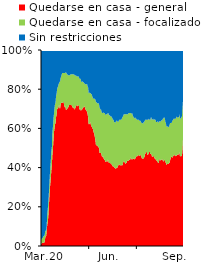
| Category | Quedarse en casa - general | Quedarse en casa - focalizado | Sin restricciones |
|---|---|---|---|
| 2020-03-01 | 1.124 | 2.247 | 96.629 |
| 2020-03-02 | 1.124 | 2.247 | 96.629 |
| 2020-03-03 | 1.685 | 2.247 | 96.067 |
| 2020-03-04 | 1.685 | 2.247 | 96.067 |
| 2020-03-05 | 1.685 | 2.809 | 95.506 |
| 2020-03-06 | 1.685 | 3.371 | 94.944 |
| 2020-03-07 | 1.685 | 3.371 | 94.944 |
| 2020-03-08 | 2.247 | 3.371 | 94.382 |
| 2020-03-09 | 3.933 | 3.371 | 92.697 |
| 2020-03-10 | 5.056 | 2.809 | 92.135 |
| 2020-03-11 | 5.056 | 2.809 | 92.135 |
| 2020-03-12 | 7.865 | 2.247 | 89.888 |
| 2020-03-13 | 10.674 | 5.618 | 83.708 |
| 2020-03-14 | 12.36 | 6.18 | 81.461 |
| 2020-03-15 | 14.607 | 7.303 | 78.09 |
| 2020-03-16 | 19.101 | 6.742 | 74.157 |
| 2020-03-17 | 24.157 | 6.742 | 69.101 |
| 2020-03-18 | 28.652 | 7.303 | 64.045 |
| 2020-03-19 | 32.022 | 8.427 | 59.551 |
| 2020-03-20 | 34.831 | 8.989 | 56.18 |
| 2020-03-21 | 38.764 | 9.551 | 51.685 |
| 2020-03-22 | 41.573 | 8.989 | 49.438 |
| 2020-03-23 | 46.629 | 11.236 | 42.135 |
| 2020-03-24 | 49.438 | 11.236 | 39.326 |
| 2020-03-25 | 53.933 | 10.674 | 35.393 |
| 2020-03-26 | 57.865 | 9.551 | 32.584 |
| 2020-03-27 | 60.112 | 10.112 | 29.775 |
| 2020-03-28 | 62.36 | 10.112 | 27.528 |
| 2020-03-29 | 62.36 | 10.674 | 26.966 |
| 2020-03-30 | 65.73 | 10.674 | 23.596 |
| 2020-03-31 | 66.854 | 10.674 | 22.472 |
| 2020-04-01 | 70.225 | 9.551 | 20.225 |
| 2020-04-02 | 69.663 | 11.236 | 19.101 |
| 2020-04-03 | 70.225 | 11.236 | 18.539 |
| 2020-04-04 | 71.348 | 11.236 | 17.416 |
| 2020-04-05 | 71.91 | 11.236 | 16.854 |
| 2020-04-06 | 70.225 | 13.483 | 16.292 |
| 2020-04-07 | 70.225 | 14.045 | 15.73 |
| 2020-04-08 | 72.472 | 13.483 | 14.045 |
| 2020-04-09 | 73.034 | 13.483 | 13.483 |
| 2020-04-10 | 73.034 | 14.607 | 12.36 |
| 2020-04-11 | 73.034 | 15.169 | 11.798 |
| 2020-04-12 | 73.034 | 15.169 | 11.798 |
| 2020-04-13 | 73.596 | 14.607 | 11.798 |
| 2020-04-14 | 73.034 | 15.169 | 11.798 |
| 2020-04-15 | 70.787 | 17.416 | 11.798 |
| 2020-04-16 | 71.348 | 16.854 | 11.798 |
| 2020-04-17 | 71.348 | 16.854 | 11.798 |
| 2020-04-18 | 69.663 | 19.101 | 11.236 |
| 2020-04-19 | 69.663 | 18.539 | 11.798 |
| 2020-04-20 | 69.663 | 17.978 | 12.36 |
| 2020-04-21 | 70.225 | 17.416 | 12.36 |
| 2020-04-22 | 70.787 | 16.292 | 12.921 |
| 2020-04-23 | 70.787 | 16.292 | 12.921 |
| 2020-04-24 | 71.91 | 15.169 | 12.921 |
| 2020-04-25 | 71.91 | 15.169 | 12.921 |
| 2020-04-26 | 71.91 | 15.169 | 12.921 |
| 2020-04-27 | 71.91 | 15.73 | 12.36 |
| 2020-04-28 | 71.91 | 15.73 | 12.36 |
| 2020-04-29 | 71.91 | 15.73 | 12.36 |
| 2020-04-30 | 71.348 | 16.292 | 12.36 |
| 2020-05-01 | 70.621 | 16.949 | 12.429 |
| 2020-05-02 | 70.621 | 16.949 | 12.429 |
| 2020-05-03 | 70.621 | 16.949 | 12.429 |
| 2020-05-04 | 69.492 | 17.514 | 12.994 |
| 2020-05-05 | 70.621 | 16.949 | 12.429 |
| 2020-05-06 | 70.056 | 16.949 | 12.994 |
| 2020-05-07 | 71.186 | 15.819 | 12.994 |
| 2020-05-08 | 71.751 | 14.689 | 13.559 |
| 2020-05-09 | 71.751 | 15.254 | 12.994 |
| 2020-05-10 | 71.186 | 15.254 | 13.559 |
| 2020-05-11 | 71.751 | 14.689 | 13.559 |
| 2020-05-12 | 71.751 | 14.689 | 13.559 |
| 2020-05-13 | 71.751 | 14.689 | 13.559 |
| 2020-05-14 | 69.492 | 15.819 | 14.689 |
| 2020-05-15 | 70.056 | 15.254 | 14.689 |
| 2020-05-16 | 70.056 | 15.254 | 14.689 |
| 2020-05-17 | 68.927 | 15.819 | 15.254 |
| 2020-05-18 | 69.492 | 14.124 | 16.384 |
| 2020-05-19 | 69.492 | 14.124 | 16.384 |
| 2020-05-20 | 70.056 | 14.124 | 15.819 |
| 2020-05-21 | 70.621 | 12.994 | 16.384 |
| 2020-05-22 | 70.621 | 12.994 | 16.384 |
| 2020-05-23 | 71.186 | 11.864 | 16.949 |
| 2020-05-24 | 71.186 | 11.864 | 16.949 |
| 2020-05-25 | 70.621 | 11.864 | 17.514 |
| 2020-05-26 | 69.492 | 12.994 | 17.514 |
| 2020-05-27 | 69.492 | 12.994 | 17.514 |
| 2020-05-28 | 68.927 | 13.559 | 17.514 |
| 2020-05-29 | 68.362 | 14.124 | 17.514 |
| 2020-05-30 | 67.232 | 14.124 | 18.644 |
| 2020-05-31 | 65.537 | 15.254 | 19.209 |
| 2020-06-01 | 62.147 | 15.819 | 22.034 |
| 2020-06-02 | 62.147 | 15.819 | 22.034 |
| 2020-06-03 | 62.5 | 15.909 | 21.591 |
| 2020-06-04 | 63.277 | 14.689 | 22.034 |
| 2020-06-05 | 62.147 | 15.819 | 22.034 |
| 2020-06-06 | 61.017 | 16.384 | 22.599 |
| 2020-06-07 | 61.017 | 16.384 | 22.599 |
| 2020-06-08 | 59.887 | 16.384 | 23.729 |
| 2020-06-09 | 59.887 | 15.819 | 24.294 |
| 2020-06-10 | 58.757 | 16.384 | 24.859 |
| 2020-06-11 | 57.627 | 17.514 | 24.859 |
| 2020-06-12 | 57.062 | 18.079 | 24.859 |
| 2020-06-13 | 55.367 | 19.774 | 24.859 |
| 2020-06-14 | 54.237 | 20.339 | 25.424 |
| 2020-06-15 | 51.412 | 22.034 | 26.554 |
| 2020-06-16 | 51.412 | 22.034 | 26.554 |
| 2020-06-17 | 51.412 | 21.469 | 27.119 |
| 2020-06-18 | 50.847 | 22.034 | 27.119 |
| 2020-06-19 | 50.847 | 22.034 | 27.119 |
| 2020-06-20 | 50.282 | 22.599 | 27.119 |
| 2020-06-21 | 50.282 | 22.034 | 27.684 |
| 2020-06-22 | 47.458 | 23.164 | 29.379 |
| 2020-06-23 | 47.458 | 22.599 | 29.944 |
| 2020-06-24 | 47.458 | 22.034 | 30.508 |
| 2020-06-25 | 47.458 | 22.034 | 30.508 |
| 2020-06-26 | 46.328 | 22.034 | 31.638 |
| 2020-06-27 | 45.198 | 22.599 | 32.203 |
| 2020-06-28 | 45.763 | 22.034 | 32.203 |
| 2020-06-29 | 45.763 | 22.599 | 31.638 |
| 2020-06-30 | 44.633 | 23.164 | 32.203 |
| 2020-07-01 | 44.068 | 23.729 | 32.203 |
| 2020-07-02 | 44.068 | 23.729 | 32.203 |
| 2020-07-03 | 42.938 | 23.729 | 33.333 |
| 2020-07-04 | 42.938 | 24.294 | 32.768 |
| 2020-07-05 | 43.503 | 23.729 | 32.768 |
| 2020-07-06 | 42.938 | 24.294 | 32.768 |
| 2020-07-07 | 42.938 | 24.294 | 32.768 |
| 2020-07-08 | 44.068 | 23.729 | 32.203 |
| 2020-07-09 | 43.503 | 24.294 | 32.203 |
| 2020-07-10 | 42.373 | 24.294 | 33.333 |
| 2020-07-11 | 42.373 | 24.294 | 33.333 |
| 2020-07-12 | 42.373 | 24.294 | 33.333 |
| 2020-07-13 | 42.373 | 23.729 | 33.898 |
| 2020-07-14 | 41.808 | 24.294 | 33.898 |
| 2020-07-15 | 41.808 | 24.294 | 33.898 |
| 2020-07-16 | 41.243 | 24.294 | 34.463 |
| 2020-07-17 | 40.678 | 24.294 | 35.028 |
| 2020-07-18 | 40.678 | 23.729 | 35.593 |
| 2020-07-19 | 40.678 | 23.729 | 35.593 |
| 2020-07-20 | 40.113 | 23.164 | 36.723 |
| 2020-07-21 | 40.113 | 23.164 | 36.723 |
| 2020-07-22 | 39.548 | 23.164 | 37.288 |
| 2020-07-23 | 39.548 | 23.729 | 36.723 |
| 2020-07-24 | 39.548 | 24.294 | 36.158 |
| 2020-07-25 | 40.113 | 23.729 | 36.158 |
| 2020-07-26 | 40.113 | 23.729 | 36.158 |
| 2020-07-27 | 40.113 | 23.164 | 36.723 |
| 2020-07-28 | 41.243 | 22.034 | 36.723 |
| 2020-07-29 | 41.243 | 22.599 | 36.158 |
| 2020-07-30 | 41.808 | 22.599 | 35.593 |
| 2020-07-31 | 41.243 | 23.164 | 35.593 |
| 2020-08-01 | 41.243 | 23.164 | 35.593 |
| 2020-08-02 | 41.243 | 23.164 | 35.593 |
| 2020-08-03 | 41.243 | 23.164 | 35.593 |
| 2020-08-04 | 41.243 | 23.729 | 35.028 |
| 2020-08-05 | 41.243 | 24.294 | 34.463 |
| 2020-08-06 | 41.808 | 24.294 | 33.898 |
| 2020-08-07 | 43.503 | 23.164 | 33.333 |
| 2020-08-08 | 42.938 | 24.294 | 32.768 |
| 2020-08-09 | 42.938 | 24.294 | 32.768 |
| 2020-08-10 | 42.373 | 24.859 | 32.768 |
| 2020-08-11 | 41.808 | 25.424 | 32.768 |
| 2020-08-12 | 42.373 | 24.859 | 32.768 |
| 2020-08-13 | 42.373 | 24.859 | 32.768 |
| 2020-08-14 | 43.503 | 23.729 | 32.768 |
| 2020-08-15 | 43.503 | 23.729 | 32.768 |
| 2020-08-16 | 43.503 | 23.729 | 32.768 |
| 2020-08-17 | 43.503 | 24.294 | 32.203 |
| 2020-08-18 | 44.068 | 23.729 | 32.203 |
| 2020-08-19 | 44.068 | 23.729 | 32.203 |
| 2020-08-20 | 44.068 | 23.729 | 32.203 |
| 2020-08-21 | 45.198 | 22.599 | 32.203 |
| 2020-08-22 | 44.633 | 23.164 | 32.203 |
| 2020-08-23 | 44.068 | 23.164 | 32.768 |
| 2020-08-24 | 44.633 | 23.164 | 32.203 |
| 2020-08-25 | 44.068 | 22.599 | 33.333 |
| 2020-08-26 | 44.633 | 21.469 | 33.898 |
| 2020-08-27 | 44.633 | 20.904 | 34.463 |
| 2020-08-28 | 44.068 | 20.904 | 35.028 |
| 2020-08-29 | 44.633 | 20.904 | 34.463 |
| 2020-08-30 | 44.633 | 20.904 | 34.463 |
| 2020-08-31 | 45.198 | 19.774 | 35.028 |
| 2020-09-01 | 45.763 | 19.209 | 35.028 |
| 2020-09-02 | 45.763 | 18.644 | 35.593 |
| 2020-09-03 | 45.763 | 18.644 | 35.593 |
| 2020-09-04 | 46.328 | 18.079 | 35.593 |
| 2020-09-05 | 46.328 | 18.079 | 35.593 |
| 2020-09-06 | 46.328 | 18.079 | 35.593 |
| 2020-09-07 | 45.763 | 18.079 | 36.158 |
| 2020-09-08 | 46.328 | 17.514 | 36.158 |
| 2020-09-09 | 46.328 | 17.514 | 36.158 |
| 2020-09-10 | 46.328 | 16.949 | 36.723 |
| 2020-09-11 | 45.198 | 17.514 | 37.288 |
| 2020-09-12 | 44.633 | 18.079 | 37.288 |
| 2020-09-13 | 44.633 | 18.079 | 37.288 |
| 2020-09-14 | 44.633 | 17.514 | 37.853 |
| 2020-09-15 | 44.633 | 18.644 | 36.723 |
| 2020-09-16 | 45.198 | 18.079 | 36.723 |
| 2020-09-17 | 45.763 | 18.079 | 36.158 |
| 2020-09-18 | 47.458 | 16.949 | 35.593 |
| 2020-09-19 | 46.893 | 17.514 | 35.593 |
| 2020-09-20 | 48.023 | 16.384 | 35.593 |
| 2020-09-21 | 48.023 | 16.384 | 35.593 |
| 2020-09-22 | 46.893 | 17.514 | 35.593 |
| 2020-09-23 | 46.328 | 18.079 | 35.593 |
| 2020-09-24 | 46.893 | 17.514 | 35.593 |
| 2020-09-25 | 47.458 | 17.514 | 35.028 |
| 2020-09-26 | 48.023 | 16.384 | 35.593 |
| 2020-09-27 | 48.023 | 16.384 | 35.593 |
| 2020-09-28 | 46.893 | 17.514 | 35.593 |
| 2020-09-29 | 46.893 | 18.644 | 34.463 |
| 2020-09-30 | 46.893 | 18.644 | 34.463 |
| 2020-10-01 | 45.763 | 18.644 | 35.593 |
| 2020-10-02 | 45.455 | 19.318 | 35.227 |
| 2020-10-03 | 45.763 | 18.644 | 35.593 |
| 2020-10-04 | 45.763 | 18.644 | 35.593 |
| 2020-10-05 | 45.763 | 19.209 | 35.028 |
| 2020-10-06 | 44.633 | 19.774 | 35.593 |
| 2020-10-07 | 44.633 | 19.774 | 35.593 |
| 2020-10-08 | 44.633 | 19.774 | 35.593 |
| 2020-10-09 | 43.503 | 19.774 | 36.723 |
| 2020-10-10 | 43.503 | 19.774 | 36.723 |
| 2020-10-11 | 44.068 | 19.209 | 36.723 |
| 2020-10-12 | 42.938 | 20.904 | 36.158 |
| 2020-10-13 | 42.373 | 20.339 | 37.288 |
| 2020-10-14 | 42.373 | 20.904 | 36.723 |
| 2020-10-15 | 43.503 | 20.339 | 36.158 |
| 2020-10-16 | 44.633 | 18.644 | 36.723 |
| 2020-10-17 | 44.068 | 19.774 | 36.158 |
| 2020-10-18 | 43.503 | 19.774 | 36.723 |
| 2020-10-19 | 44.068 | 19.774 | 36.158 |
| 2020-10-20 | 44.068 | 20.339 | 35.593 |
| 2020-10-21 | 43.503 | 20.339 | 36.158 |
| 2020-10-22 | 44.633 | 20.339 | 35.028 |
| 2020-10-23 | 42.938 | 22.034 | 35.028 |
| 2020-10-24 | 43.503 | 22.034 | 34.463 |
| 2020-10-25 | 44.068 | 21.469 | 34.463 |
| 2020-10-26 | 43.503 | 21.469 | 35.028 |
| 2020-10-27 | 42.373 | 20.904 | 36.723 |
| 2020-10-28 | 42.938 | 19.774 | 37.288 |
| 2020-10-29 | 41.243 | 19.774 | 38.983 |
| 2020-10-30 | 41.808 | 19.209 | 38.983 |
| 2020-10-31 | 41.808 | 19.209 | 38.983 |
| 2020-11-01 | 41.808 | 19.209 | 38.983 |
| 2020-11-02 | 41.808 | 18.644 | 39.548 |
| 2020-11-03 | 42.373 | 18.644 | 38.983 |
| 2020-11-04 | 42.373 | 19.209 | 38.418 |
| 2020-11-05 | 43.503 | 19.209 | 37.288 |
| 2020-11-06 | 44.633 | 18.079 | 37.288 |
| 2020-11-07 | 45.198 | 17.514 | 37.288 |
| 2020-11-08 | 45.763 | 16.949 | 37.288 |
| 2020-11-09 | 45.198 | 18.644 | 36.158 |
| 2020-11-10 | 45.198 | 18.644 | 36.158 |
| 2020-11-11 | 45.763 | 18.644 | 35.593 |
| 2020-11-12 | 46.328 | 18.644 | 35.028 |
| 2020-11-13 | 46.328 | 18.644 | 35.028 |
| 2020-11-14 | 46.328 | 18.644 | 35.028 |
| 2020-11-15 | 46.328 | 18.644 | 35.028 |
| 2020-11-16 | 45.763 | 19.209 | 35.028 |
| 2020-11-17 | 45.93 | 19.767 | 34.302 |
| 2020-11-18 | 46.199 | 19.883 | 33.918 |
| 2020-11-19 | 46.471 | 18.824 | 34.706 |
| 2020-11-20 | 46.746 | 18.935 | 34.32 |
| 2020-11-21 | 46.746 | 18.935 | 34.32 |
| 2020-11-22 | 46.746 | 18.935 | 34.32 |
| 2020-11-23 | 47.904 | 19.162 | 32.934 |
| 2020-11-24 | 45.985 | 19.708 | 34.307 |
| 2020-11-25 | 45.802 | 19.084 | 35.115 |
| 2020-11-26 | 45.736 | 19.38 | 34.884 |
| 2020-11-27 | 46.032 | 19.841 | 34.127 |
| 2020-11-28 | 45.968 | 20.161 | 33.871 |
| 2020-11-29 | 49.524 | 20.952 | 29.524 |
| 2020-11-30 | 55.128 | 19.231 | 25.641 |